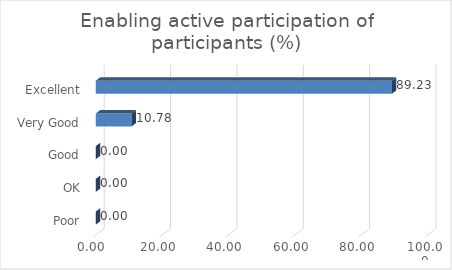
| Category | Enabling active participation of participants (%) |
|---|---|
| Poor | 0 |
| OK | 0 |
| Good | 0 |
| Very Good | 10.78 |
| Excellent | 89.23 |